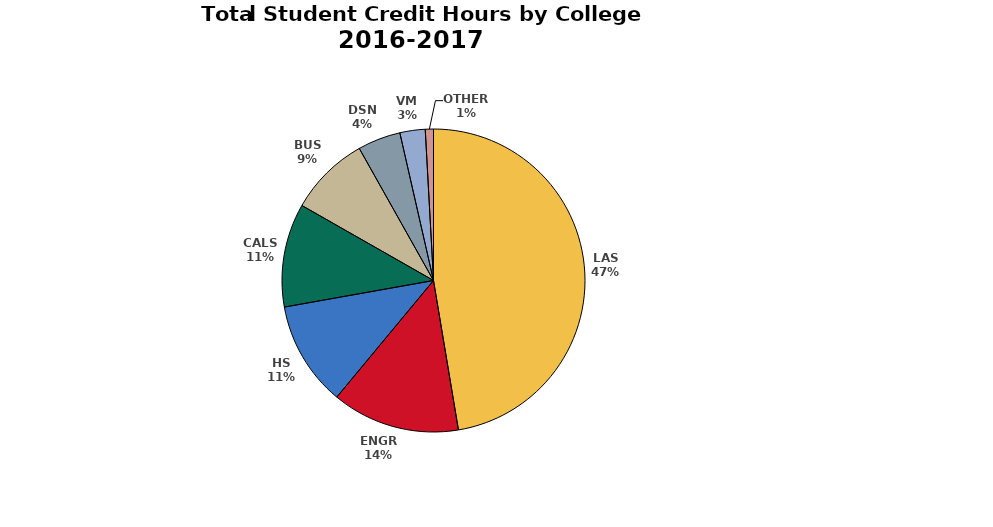
| Category | FY2017 |
|---|---|
| LAS | 475623 |
| ENGR | 137123 |
| HS | 112175 |
| CALS | 110962 |
| BUS | 86430 |
| DSN | 46005 |
| VM | 27088 |
| OTHER | 8733 |